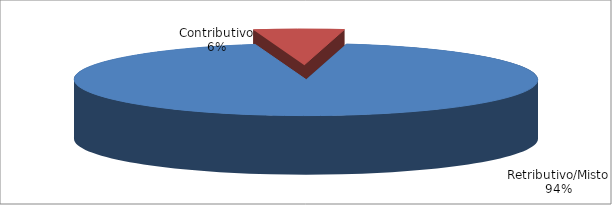
| Category | Series 1 |
|---|---|
| Retributivo/Misto | 40512 |
| Contributivo | 2720 |